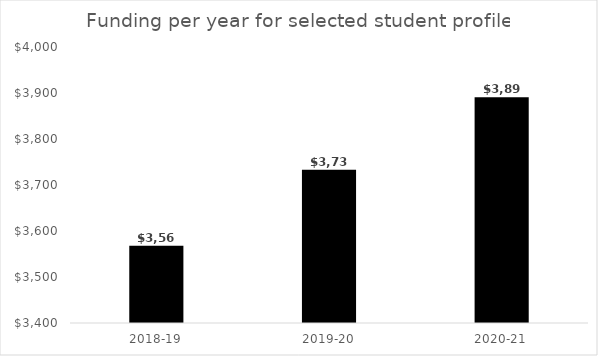
| Category | Funding per year for selected student profile |
|---|---|
| 2018-19 | 3568 |
| 2019-20 | 3733.333 |
| 2020-21 | 3891 |